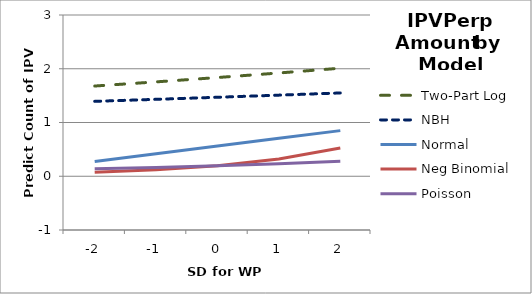
| Category | Two-Part Log | NBH | Normal | Neg Binomial | Poisson |
|---|---|---|---|---|---|
| -2.0 | 1.678 | 1.394 | 0.273 | 0.074 | 0.138 |
| -1.0 | 1.756 | 1.431 | 0.417 | 0.121 | 0.164 |
| 0.0 | 1.837 | 1.47 | 0.561 | 0.198 | 0.196 |
| 1.0 | 1.921 | 1.509 | 0.705 | 0.323 | 0.234 |
| 2.0 | 2.01 | 1.55 | 0.849 | 0.527 | 0.28 |